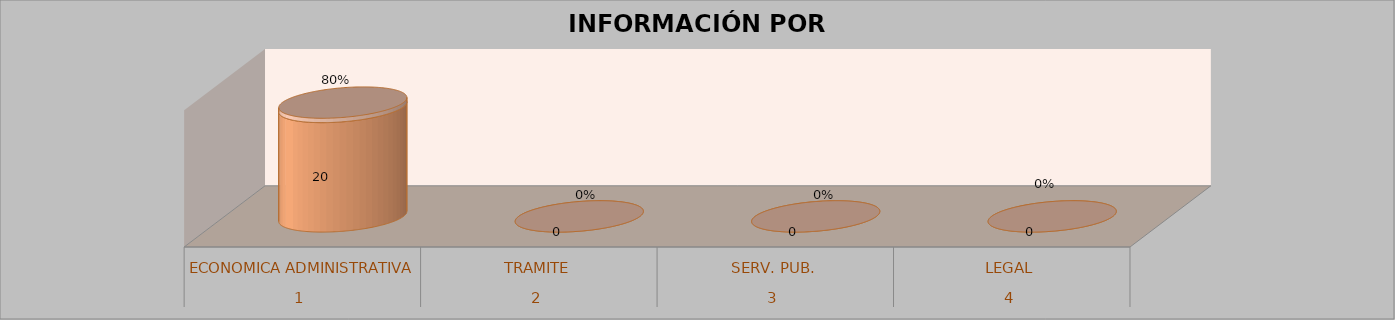
| Category | Series 0 | Series 1 | Series 2 | Series 3 |
|---|---|---|---|---|
| 0 |  |  | 20 | 0.8 |
| 1 |  |  | 0 | 0 |
| 2 |  |  | 0 | 0 |
| 3 |  |  | 0 | 0 |